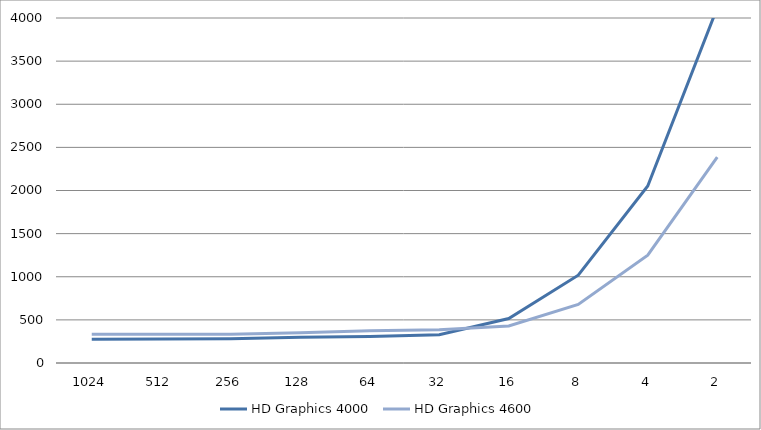
| Category | HD Graphics 4000 | HD Graphics 4600 |
|---|---|---|
| 1024.0 | 275 | 333 |
| 512.0 | 278 | 334 |
| 256.0 | 282 | 334 |
| 128.0 | 299 | 352 |
| 64.0 | 307 | 373 |
| 32.0 | 328 | 386 |
| 16.0 | 516 | 430 |
| 8.0 | 1018 | 679 |
| 4.0 | 2052 | 1251 |
| 2.0 | 4118 | 2386 |